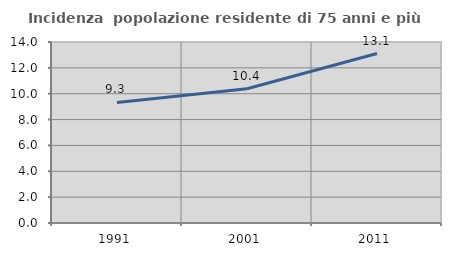
| Category | Incidenza  popolazione residente di 75 anni e più |
|---|---|
| 1991.0 | 9.325 |
| 2001.0 | 10.383 |
| 2011.0 | 13.11 |